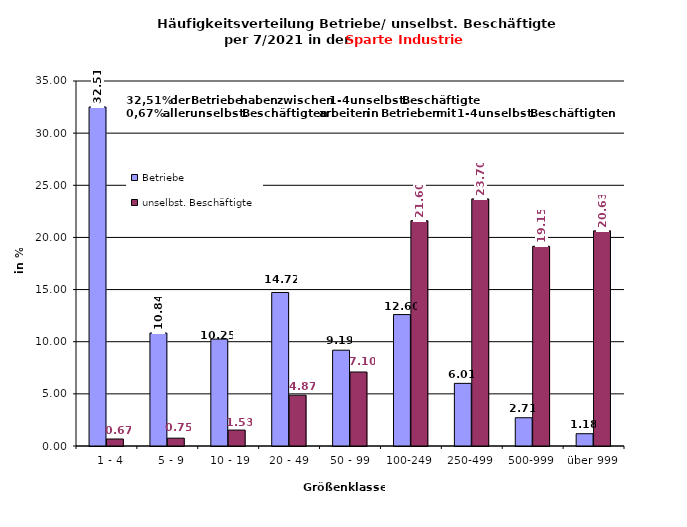
| Category | Betriebe | unselbst. Beschäftigte |
|---|---|---|
|   1 - 4 | 32.509 | 0.672 |
|   5 - 9 | 10.836 | 0.751 |
|  10 - 19 | 10.247 | 1.528 |
| 20 - 49 | 14.723 | 4.874 |
| 50 - 99 | 9.187 | 7.096 |
| 100-249 | 12.603 | 21.605 |
| 250-499 | 6.007 | 23.695 |
| 500-999 | 2.709 | 19.149 |
| über 999 | 1.178 | 20.631 |